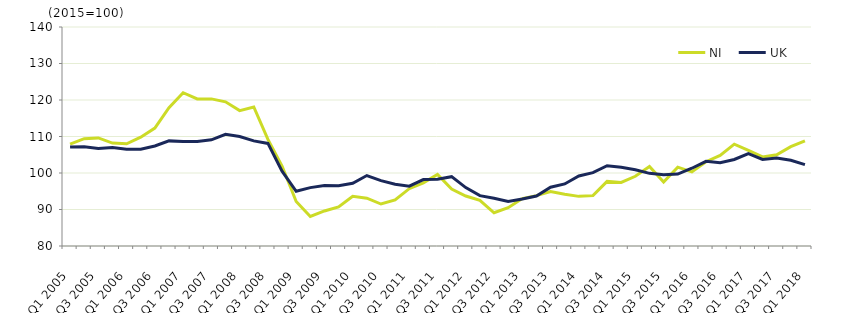
| Category | NI  | UK  |
|---|---|---|
| Q1 2005 | 107.9 | 107.1 |
|  | 109.4 | 107.2 |
| Q3 2005 | 109.6 | 106.7 |
|  | 108.2 | 107 |
| Q1 2006 | 108 | 106.5 |
|  | 109.8 | 106.5 |
| Q3 2006 | 112.3 | 107.4 |
|  | 117.9 | 108.8 |
| Q1 2007 | 122 | 108.6 |
|  | 120.3 | 108.6 |
| Q3 2007 | 120.3 | 109.1 |
|  | 119.5 | 110.6 |
| Q1 2008 | 117.1 | 110 |
|  | 118.1 | 108.8 |
| Q3 2008 | 109.2 | 108.1 |
|  | 101.9 | 100.5 |
| Q1 2009 | 92.2 | 95 |
|  | 88.1 | 96 |
| Q3 2009 | 89.6 | 96.6 |
|  | 90.7 | 96.5 |
| Q1 2010 | 93.6 | 97.2 |
|  | 93.1 | 99.3 |
| Q3 2010 | 91.5 | 97.9 |
|  | 92.6 | 96.9 |
| Q1 2011 | 95.7 | 96.4 |
|  | 97.3 | 98.2 |
| Q3 2011 | 99.6 | 98.3 |
|  | 95.6 | 99 |
| Q1 2012 | 93.7 | 96 |
|  | 92.5 | 93.8 |
| Q3 2012 | 89.1 | 93.1 |
|  | 90.5 | 92.2 |
| Q1 2013 | 93 | 92.9 |
|  | 93.8 | 93.7 |
| Q3 2013 | 94.9 | 96.1 |
|  | 94.2 | 97 |
| Q1 2014 | 93.6 | 99.2 |
|  | 93.8 | 100.1 |
| Q3 2014 | 97.7 | 102 |
|  | 97.4 | 101.6 |
| Q1 2015 | 99.1 | 100.9 |
|  | 101.8 | 99.9 |
| Q3 2015 | 97.5 | 99.5 |
|  | 101.6 | 99.7 |
| Q1 2016 | 100.3 | 101.3 |
|  | 103.1 | 103.2 |
| Q3 2016 | 104.8 | 102.8 |
|  | 107.9 | 103.7 |
| Q1 2017 | 106.2 | 105.3 |
|  | 104.4 | 103.7 |
| Q3 2017 | 105 | 104.1 |
|  | 107.2 | 103.5 |
| Q1 2018 | 108.8 | 102.3 |